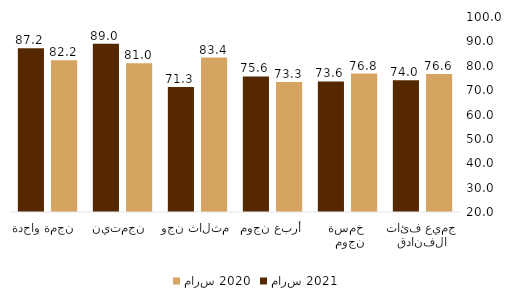
| Category | مارس 2020 | مارس 2021 |
|---|---|---|
| جميع فئات الفنادق | 76.648 | 74.013 |
|  خمسة نجوم  | 76.803 | 73.559 |
| أربع نجوم | 73.333 | 75.621 |
| ثلاث نجوم  | 83.352 | 71.315 |
| نجمتين  | 81.028 | 88.991 |
| نجمة واحدة  | 82.215 | 87.174 |